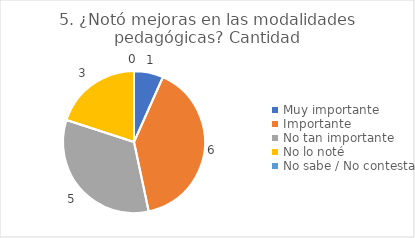
| Category | 5. ¿Notó mejoras en las modalidades pedagógicas? |
|---|---|
| Muy importante  | 0.067 |
| Importante  | 0.4 |
| No tan importante  | 0.333 |
| No lo noté  | 0.2 |
| No sabe / No contesta | 0 |